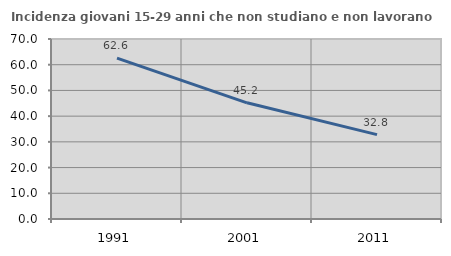
| Category | Incidenza giovani 15-29 anni che non studiano e non lavorano  |
|---|---|
| 1991.0 | 62.553 |
| 2001.0 | 45.183 |
| 2011.0 | 32.823 |